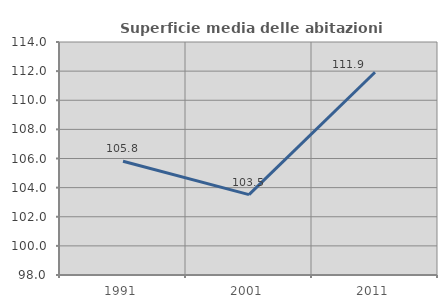
| Category | Superficie media delle abitazioni occupate |
|---|---|
| 1991.0 | 105.809 |
| 2001.0 | 103.518 |
| 2011.0 | 111.921 |